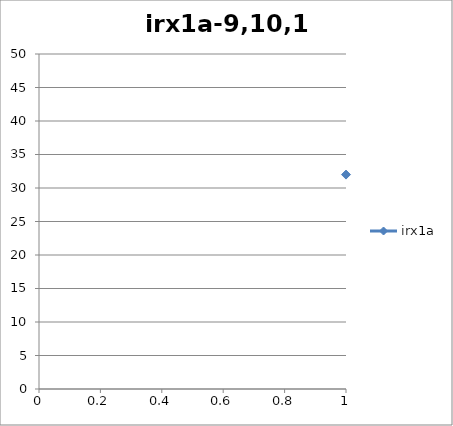
| Category | irx1a |
|---|---|
| 0 | 32 |
| 1 | 34 |
| 2 | 44 |
| 3 | 5 |
| 4 | 32 |
| 5 | 8 |
| 6 | 20 |
| 7 | 2 |
| 8 | 13 |
| 9 | 11 |
| 10 | 11 |